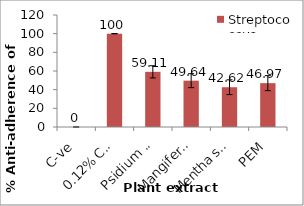
| Category | Streptococcus mutans ATCC 25175 |
|---|---|
| C-ve | 0 |
| 0.12% CHX | 100 |
| Psidium sp. | 59.11 |
| Mangifera sp. | 49.64 |
| Mentha sp. | 42.62 |
| PEM | 46.97 |